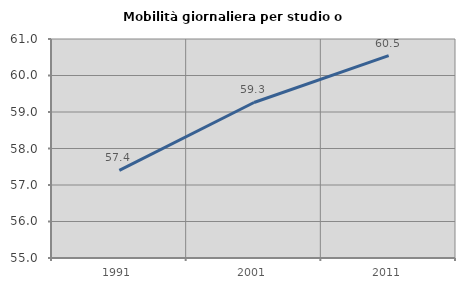
| Category | Mobilità giornaliera per studio o lavoro |
|---|---|
| 1991.0 | 57.401 |
| 2001.0 | 59.261 |
| 2011.0 | 60.545 |